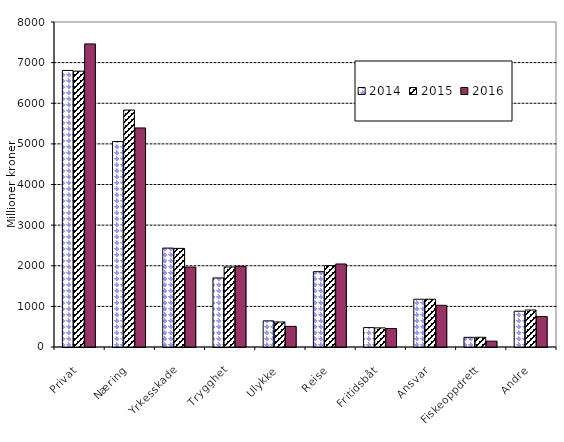
| Category | 2014 | 2015 | 2016 |
|---|---|---|---|
| Privat | 6807.421 | 6790.108 | 7461.039 |
| Næring | 5057.481 | 5832.965 | 5391.97 |
| Yrkesskade | 2434.703 | 2427.398 | 1966.977 |
| Trygghet | 1700.293 | 1969.218 | 1986.795 |
| Ulykke | 643.955 | 617.196 | 507.423 |
| Reise | 1854.319 | 2002.965 | 2043.508 |
| Fritidsbåt | 477.564 | 470.834 | 453.982 |
| Ansvar | 1175.414 | 1175.94 | 1026.439 |
| Fiskeoppdrett | 238.075 | 239.901 | 144.281 |
| Andre | 880.462 | 910.879 | 749.461 |